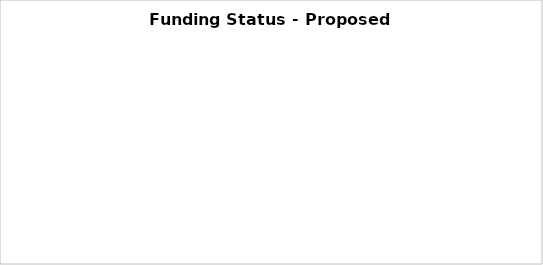
| Category | Series 0 |
|---|---|
| Discretionary - LOI Request | 0 |
| Grants awarded | 0 |
| Approved PFCs | 0 |
| Approved bonds | 0 |
| Future grants | 0 |
| Future PFCs | 0 |
| Future bonds | 0 |
| Other | 0 |